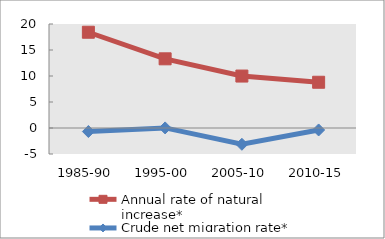
| Category | Annual rate of natural increase* | Crude net migration rate* |
|---|---|---|
| 1985-90 | 18.414 | -0.679 |
| 1995-00 | 13.304 | 0.017 |
| 2005-10 | 9.99 | -3.134 |
| 2010-15 | 8.796 | -0.377 |